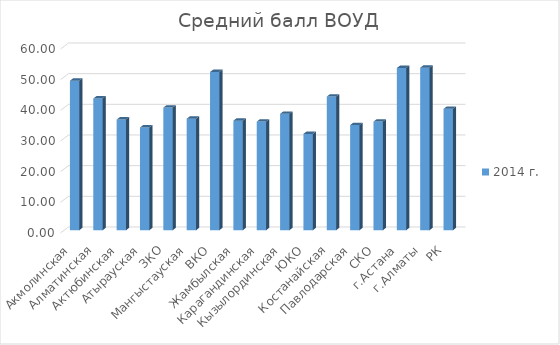
| Category | 2014 г. |
|---|---|
| Акмолинская | 48.759 |
| Алматинская | 42.961 |
| Актюбинская | 36.096 |
| Атырауская | 33.517 |
| ЗКО | 39.999 |
| Мангыстауская | 36.378 |
| ВКО | 51.605 |
| Жамбылская | 35.734 |
| Карагандинская | 35.422 |
| Кызылординская | 37.96 |
| ЮКО | 31.412 |
| Костанайская | 43.596 |
| Павлодарская | 34.29 |
| СКО | 35.423 |
| г.Астана | 52.907 |
| г.Алматы | 53.002 |
| РК | 39.58 |